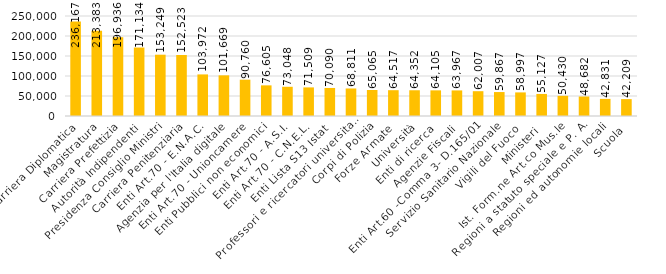
| Category | Series 0 |
|---|---|
| Carriera Diplomatica | 236166.889 |
| Magistratura | 213383.317 |
| Carriera Prefettizia | 196936.302 |
| Autorità Indipendenti | 171134.345 |
| Presidenza Consiglio Ministri | 153249.399 |
| Carriera Penitenziaria | 152523.289 |
| Enti Art.70 - E.N.A.C. | 103971.845 |
| Agenzia per l'Italia digitale | 101668.605 |
| Enti Art.70 - Unioncamere | 90760.018 |
| Enti Pubblici non economici | 76604.83 |
| Enti Art.70 - A.S.I. | 73047.705 |
| Enti Art.70 - C.N.E.L. | 71509.068 |
| Enti Lista S13 Istat | 70089.977 |
| Professori e ricercatori universitari | 68811.284 |
| Corpi di Polizia | 65065.393 |
| Forze Armate | 64517.407 |
| Università | 64351.766 |
| Enti di ricerca | 64105.317 |
| Agenzie Fiscali | 63967.11 |
| Enti Art.60 -Comma 3- D.165/01 | 62006.675 |
| Servizio Sanitario Nazionale | 59867.467 |
| Vigili del Fuoco | 58996.945 |
| Ministeri | 55127.149 |
| Ist. Form.ne Art.co Mus.le | 50430.45 |
| Regioni a statuto speciale e P. A. | 48681.713 |
| Regioni ed autonomie locali | 42831.074 |
| Scuola | 42209.415 |